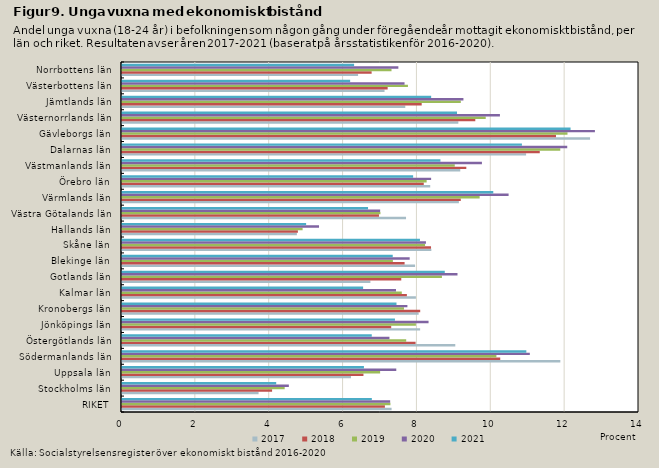
| Category | 2017 | 2018 | 2019 | 2020 | 2021 |
|---|---|---|---|---|---|
| RIKET | 7.3 | 7.119 | 7.269 | 7.262 | 6.765 |
| Stockholms län | 3.698 | 4.064 | 4.405 | 4.518 | 4.176 |
| Uppsala län | 6.202 | 6.539 | 6.99 | 7.427 | 6.551 |
| Södermanlands län | 11.869 | 10.242 | 10.139 | 11.044 | 10.949 |
| Östergötlands län | 9.025 | 7.95 | 7.696 | 7.242 | 6.763 |
| Jönköpings län | 8.073 | 7.29 | 7.959 | 8.301 | 7.391 |
| Kronobergs län | 8.033 | 8.075 | 7.636 | 7.729 | 7.433 |
| Kalmar län | 7.959 | 7.714 | 7.577 | 7.42 | 6.529 |
| Gotlands län | 6.726 | 7.562 | 8.664 | 9.085 | 8.741 |
| Blekinge län | 7.936 | 7.653 | 7.335 | 7.79 | 7.331 |
| Skåne län | 8.377 | 8.369 | 8.207 | 8.231 | 8.068 |
| Hallands län | 4.735 | 4.763 | 4.891 | 5.336 | 4.986 |
| Västra Götalands län | 7.691 | 6.959 | 6.998 | 6.991 | 6.663 |
| Värmlands län | 9.122 | 9.174 | 9.685 | 10.469 | 10.054 |
| Örebro län | 8.346 | 8.171 | 8.249 | 8.371 | 7.884 |
| Västmanlands län | 9.16 | 9.323 | 9.011 | 9.747 | 8.623 |
| Dalarnas län | 10.943 | 11.313 | 11.868 | 12.057 | 10.829 |
| Gävleborgs län | 12.675 | 11.752 | 12.063 | 12.806 | 12.147 |
| Västernorrlands län | 9.108 | 9.567 | 9.849 | 10.234 | 9.072 |
| Jämtlands län | 7.671 | 8.116 | 9.175 | 9.246 | 8.372 |
| Västerbottens län | 7.109 | 7.194 | 7.743 | 7.651 | 6.178 |
| Norrbottens län | 6.393 | 6.76 | 7.298 | 7.484 | 6.285 |